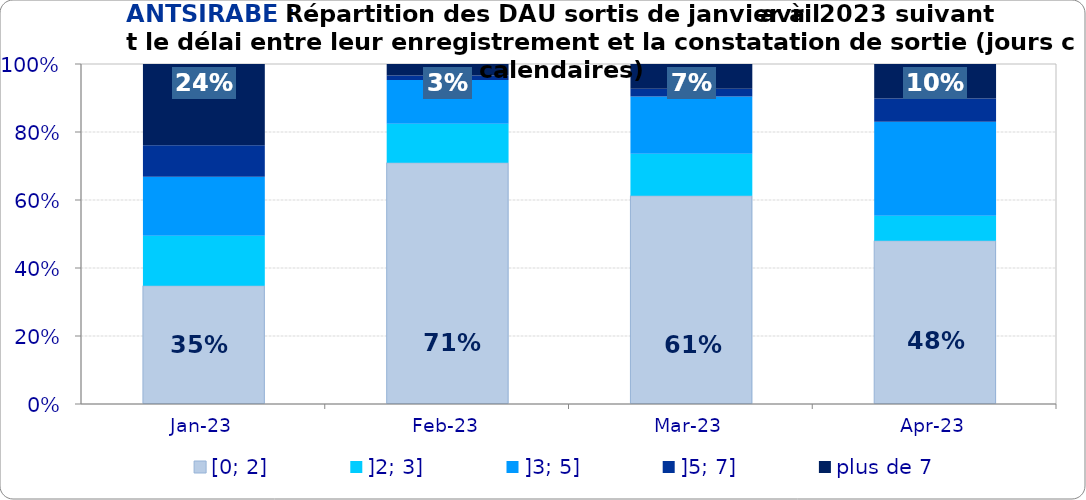
| Category | [0; 2] | ]2; 3] | ]3; 5] | ]5; 7] | plus de 7 |
|---|---|---|---|---|---|
| 2023-01-01 | 0.348 | 0.147 | 0.174 | 0.092 | 0.239 |
| 2023-02-01 | 0.709 | 0.115 | 0.128 | 0.014 | 0.034 |
| 2023-03-01 | 0.612 | 0.124 | 0.169 | 0.022 | 0.073 |
| 2023-04-01 | 0.48 | 0.073 | 0.277 | 0.068 | 0.102 |